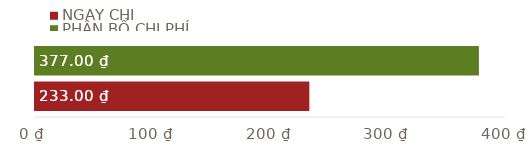
| Category | NGÀY CHI | PHÂN BỔ CHI PHÍ |
|---|---|---|
| TỔNG | 233 | 377 |